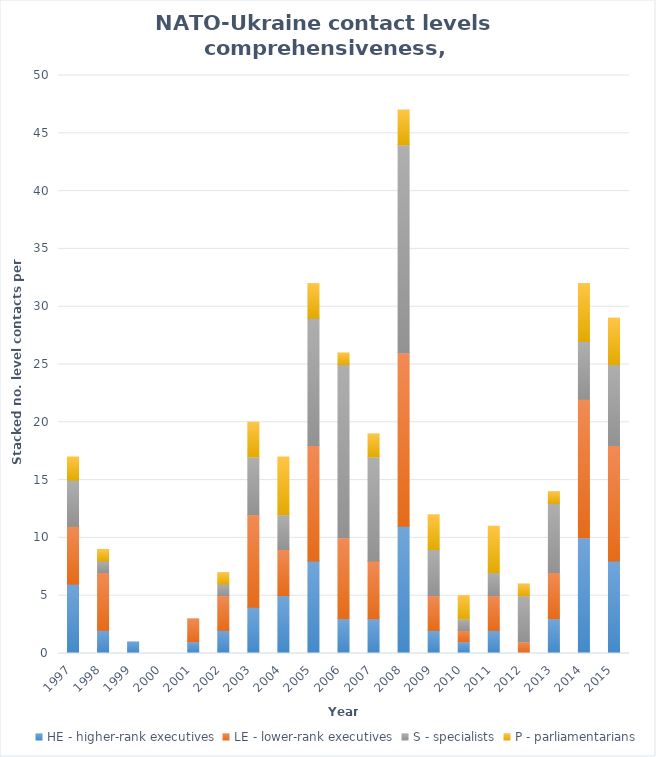
| Category | HE - higher-rank executives | LE - lower-rank executives | S - specialists | P - parliamentarians |
|---|---|---|---|---|
| 1997.0 | 6 | 5 | 4 | 2 |
| 1998.0 | 2 | 5 | 1 | 1 |
| 1999.0 | 1 | 0 | 0 | 0 |
| 2000.0 | 0 | 0 | 0 | 0 |
| 2001.0 | 1 | 2 | 0 | 0 |
| 2002.0 | 2 | 3 | 1 | 1 |
| 2003.0 | 4 | 8 | 5 | 3 |
| 2004.0 | 5 | 4 | 3 | 5 |
| 2005.0 | 8 | 10 | 11 | 3 |
| 2006.0 | 3 | 7 | 15 | 1 |
| 2007.0 | 3 | 5 | 9 | 2 |
| 2008.0 | 11 | 15 | 18 | 3 |
| 2009.0 | 2 | 3 | 4 | 3 |
| 2010.0 | 1 | 1 | 1 | 2 |
| 2011.0 | 2 | 3 | 2 | 4 |
| 2012.0 | 0 | 1 | 4 | 1 |
| 2013.0 | 3 | 4 | 6 | 1 |
| 2014.0 | 10 | 12 | 5 | 5 |
| 2015.0 | 8 | 10 | 7 | 4 |